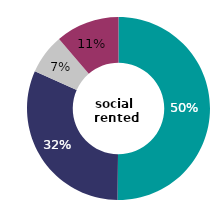
| Category | social 
rented |
|---|---|
| very satisfied | 50.174 |
| fairly satisfied | 31.476 |
| neither satisfied nor dissatisfied | 7.09 |
| all dissatisfied | 11.26 |